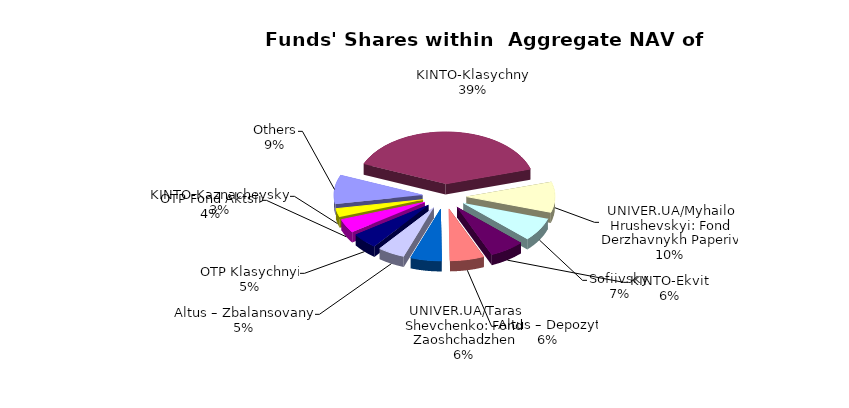
| Category | Series 0 | Series 1 |
|---|---|---|
| Others | 4981907.32 | 0.086 |
| KINTO-Klasychnyi | 21625463.94 | 0.372 |
| UNIVER.UA/Myhailo Hrushevskyi: Fond Derzhavnykh Paperiv | 5269459.29 | 0.091 |
| Sofiivskyi | 3997920.028 | 0.069 |
| KINTO-Ekviti | 3545095.39 | 0.061 |
| Altus – Depozyt | 3448481.37 | 0.059 |
| UNIVER.UA/Taras Shevchenko: Fond Zaoshchadzhen | 3150256.64 | 0.054 |
| Altus – Zbalansovanyi | 2740606.7 | 0.047 |
| ОТP Klasychnyi | 2680293.42 | 0.046 |
| OTP Fond Aktsii | 2339503.2 | 0.04 |
| KINTO-Kaznacheyskyi | 1479622.721 | 0.025 |